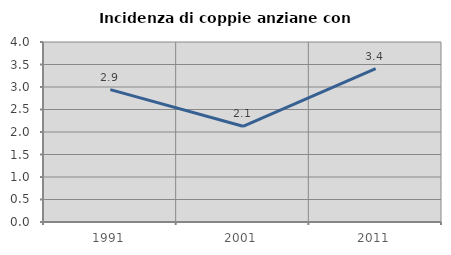
| Category | Incidenza di coppie anziane con figli |
|---|---|
| 1991.0 | 2.941 |
| 2001.0 | 2.128 |
| 2011.0 | 3.409 |